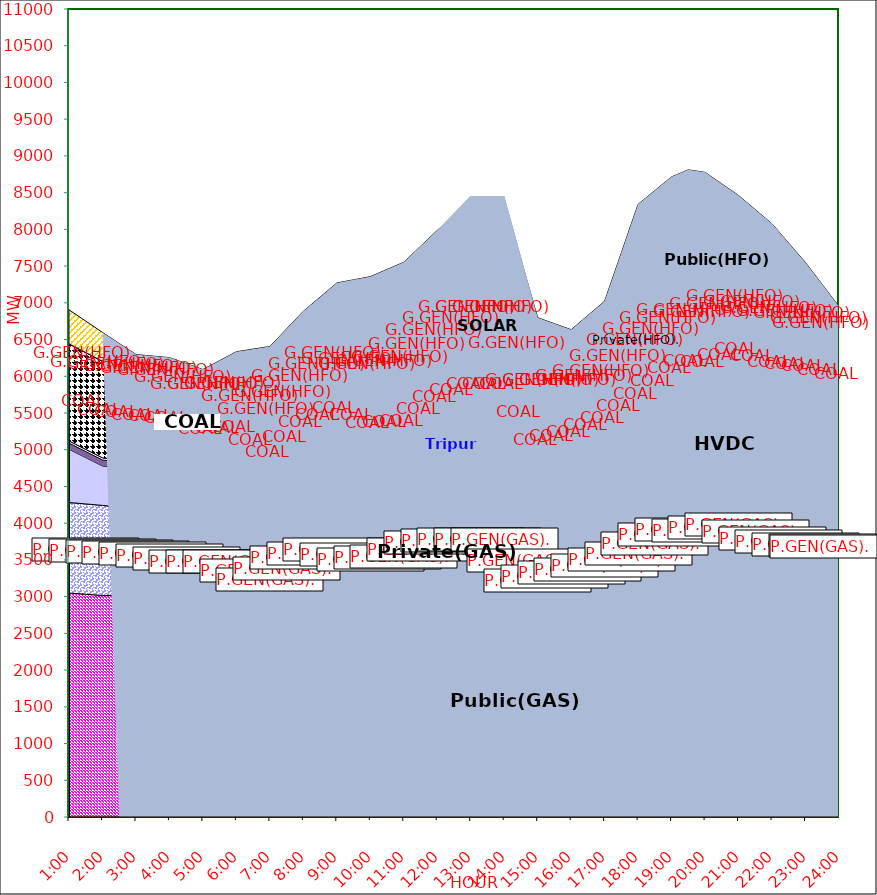
| Category | GAS | P.GEN(GAS). |  HVDC | TRIPURA | HYDRO | COAL | SOLAR | G.GEN(HFO) | P.GEN(HFO). | G.GEN(HSD) | P.GEN(HSD) | Total Energy Gen 179.178 MKWHr 
Energy Not Served   0.000 MKWHr 
Energy Requirement     179.178 MKWHr  |
|---|---|---|---|---|---|---|---|---|---|---|---|---|
| 1:00 | 3049 | 1233 | 724 | 84 | 30 | 1322 | 0 | 0 | 463 | 0 | 0 |  |
| 1:30 | 3032.5 | 1229.5 | 630 | 83 | 30 | 1318 | 0 | 0 | 428 | 0 | 0 |  |
| 2:00 | 3016 | 1226 | 536 | 82 | 30 | 1314 | 0 | 0 | 393 | 0 | 0 |  |
| 2:30 | 3017.5 | 1200.5 | 535.5 | 77 | 30 | 1311.5 | 0 | 0 | 274.5 | 0 | 0 |  |
| 3:00 | 3019 | 1175 | 535 | 72 | 30 | 1309 | 0 | 0 | 156 | 0 | 0 |  |
| 3:30 | 2990.5 | 1183.5 | 535 | 73 | 30 | 1307 | 0 | 0 | 156 | 0 | 0 |  |
| 4:00 | 2962 | 1192 | 535 | 74 | 30 | 1305 | 0 | 0 | 156 | 0 | 0 |  |
| 4:30 | 2939.5 | 1156 | 535 | 72 | 30 | 1265 | 0 | 0 | 175.5 | 0 | 0 |  |
| 5:00 | 2917 | 1120 | 535 | 70 | 30 | 1225 | 0 | 0 | 195 | 0 | 0 |  |
| 5:30 | 2903 | 1156 | 535 | 72 | 30 | 1208 | 0 | 5 | 304 | 0 | 0 |  |
| 6:00 | 2889 | 1192 | 535 | 74 | 30 | 1191 | 0 | 10 | 413 | 0 | 0 |  |
| 6:30 | 2800.5 | 1117.5 | 535 | 74 | 30 | 1176 | 0.5 | 13 | 623 | 0 | 0 |  |
| 7:00 | 2712 | 1043 | 535 | 74 | 30 | 1161 | 1 | 16 | 833 | 0 | 0 |  |
| 7:30 | 2813.5 | 1144.5 | 534.5 | 79 | 30 | 1154 | 17 | 28 | 844.5 | 0 | 0 |  |
| 8:00 | 2915 | 1246 | 534 | 84 | 30 | 1147 | 33 | 40 | 856 | 0 | 0 |  |
| 8:30 | 2956.5 | 1269 | 534.5 | 86 | 30 | 1212 | 57.5 | 45 | 887 | 0 | 0 |  |
| 9:00 | 2998 | 1292 | 535 | 88 | 30 | 1277 | 82 | 50 | 918 | 0 | 0 |  |
| 9:30 | 2948.5 | 1254.5 | 535.5 | 89 | 30 | 1237.5 | 123.5 | 60 | 1034.5 | 0 | 0 |  |
| 10:00 | 2899 | 1217 | 536 | 90 | 30 | 1198 | 165 | 70 | 1151 | 0 | 0 |  |
| 10:30 | 2909 | 1237 | 535.5 | 95 | 30 | 1153 | 219 | 78 | 1197.5 | 0 | 0 |  |
| 11:00 | 2919 | 1257 | 535 | 100 | 30 | 1108 | 273 | 86 | 1244 | 0 | 0 |  |
| 11:30 | 2953.5 | 1383 | 535 | 103 | 30 | 1112.5 | 290 | 89 | 1273 | 0 | 0 |  |
| 12:00 | 2988 | 1509 | 535 | 106 | 30 | 1117 | 307 | 92 | 1302 | 0 | 0 |  |
| 12:30 | 2994.5 | 1532 | 535 | 104 | 30 | 1242 | 315 | 89 | 1332.5 | 0 | 46 |  |
| 13:00 | 3001 | 1555 | 535 | 102 | 30 | 1367 | 323 | 86 | 1363 | 0 | 92 |  |
| 13:30 | 3001 | 1555 | 535 | 102 | 30 | 1367 | 323 | 86 | 1363 | 0 | 92 |  |
| 14:00 | 3001 | 1555 | 535 | 102 | 30 | 1367 | 323 | 86 | 1363 | 0 | 92 |  |
| 14:30 | 2769 | 1455.5 | 535 | 97 | 30 | 1266 | 265.5 | 78 | 1083.5 | 0 | 46 |  |
| 15:00 | 2537 | 1356 | 535 | 92 | 30 | 1165 | 208 | 70 | 804 | 0 | 0 |  |
| 15:30 | 2580.5 | 1376 | 534.5 | 87 | 30 | 1161 | 151 | 70 | 725.5 | 0 | 0 |  |
| 16:00 | 2624 | 1396 | 534 | 82 | 30 | 1157 | 94 | 70 | 647 | 0 | 0 |  |
| 16:30 | 2630.5 | 1483 | 534 | 86 | 30 | 1153.5 | 54.5 | 81 | 775.5 | 0 | 0 |  |
| 17:00 | 2637 | 1570 | 534 | 90 | 30 | 1150 | 15 | 92 | 904 | 0 | 0 |  |
| 17:30 | 2736 | 1540.5 | 616.5 | 96 | 30 | 1165.5 | 7.5 | 185.5 | 1304.5 | 0 | 0 |  |
| 18:00 | 2835 | 1511 | 699 | 102 | 30 | 1181 | 0 | 279 | 1705 | 0 | 0 |  |
| 18:30 | 2927.5 | 1582 | 699 | 101 | 30 | 1211.5 | 0 | 190 | 1787.5 | 0 | 0 |  |
| 19:00 | 3020 | 1653 | 699 | 100 | 30 | 1242 | 0 | 101 | 1870 | 0 | 0 |  |
| 19:30 | 3077 | 1681 | 699 | 102 | 30 | 1264 | 0 | 101 | 1856 | 0 | 0 |  |
| 20:00 | 3070 | 1662 | 698 | 104 | 30 | 1271 | 0 | 101 | 1840 | 0 | 0 |  |
| 20:30 | 3090.5 | 1707 | 698.5 | 104 | 30 | 1320 | 0 | 80.5 | 1588 | 0 | 0 |  |
| 21:00 | 3111 | 1752 | 699 | 104 | 30 | 1369 | 0 | 60 | 1336 | 0 | 0 |  |
| 21:30 | 3036 | 1712 | 699.5 | 102 | 30 | 1418 | 0 | 30 | 1240.5 | 0 | 0 |  |
| 22:00 | 2961 | 1672 | 700 | 100 | 30 | 1467 | 0 | 0 | 1145 | 0 | 0 |  |
| 22:30 | 2918 | 1669 | 735 | 96 | 30 | 1449.5 | 0 | 0 | 913.5 | 0 | 0 |  |
| 23:00 | 2875 | 1666 | 770 | 92 | 30 | 1432 | 0 | 0 | 682 | 0 | 0 |  |
| 23:30 | 2875 | 1644.5 | 747 | 87 | 30 | 1416 | 0 | 0 | 448.5 | 0 | 0 |  |
| 24:00 | 2875 | 1623 | 724 | 82 | 30 | 1400 | 0 | 0 | 215 | 0 | 0 |  |